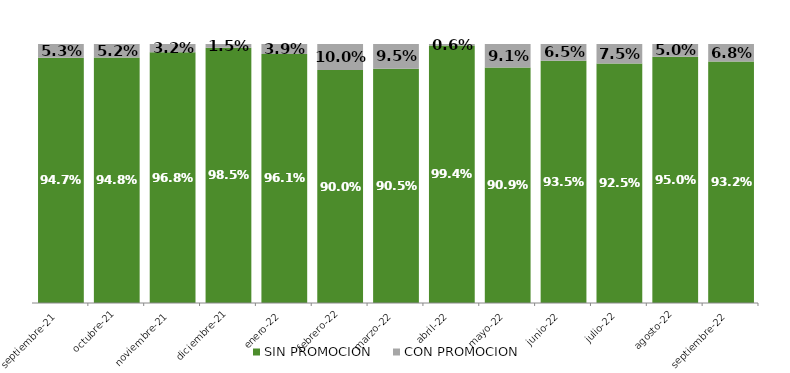
| Category | SIN PROMOCION   | CON PROMOCION   |
|---|---|---|
| 2021-09-01 | 0.947 | 0.053 |
| 2021-10-01 | 0.948 | 0.052 |
| 2021-11-01 | 0.968 | 0.032 |
| 2021-12-01 | 0.985 | 0.015 |
| 2022-01-01 | 0.961 | 0.039 |
| 2022-02-01 | 0.9 | 0.1 |
| 2022-03-01 | 0.905 | 0.095 |
| 2022-04-01 | 0.994 | 0.006 |
| 2022-05-01 | 0.909 | 0.091 |
| 2022-06-01 | 0.935 | 0.065 |
| 2022-07-01 | 0.925 | 0.075 |
| 2022-08-01 | 0.95 | 0.05 |
| 2022-09-01 | 0.932 | 0.068 |